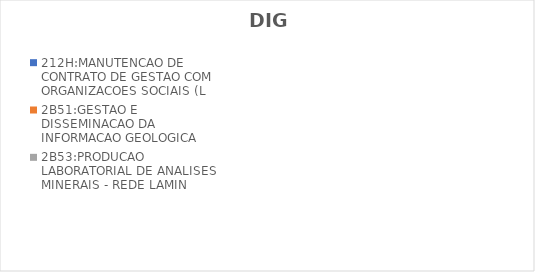
| Category | 212H:MANUTENCAO DE CONTRATO DE GESTAO COM ORGANIZACOES SOCIAIS (L | 2B51:GESTAO E DISSEMINACAO DA INFORMACAO GEOLOGICA | 2B53:PRODUCAO LABORATORIAL DE ANALISES MINERAIS - REDE LAMIN |
|---|---|---|---|
| EXECUTADO | 0 | 0.661 | 0.328 |